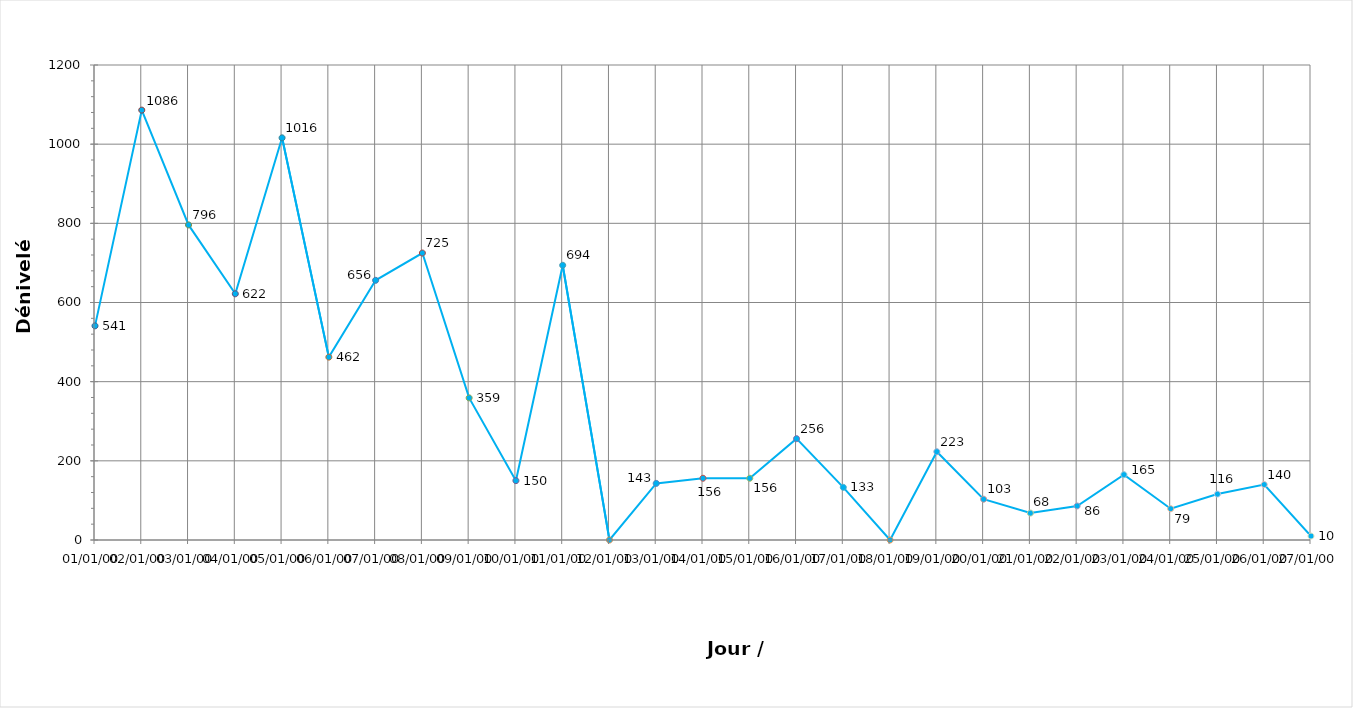
| Category | Series 0 |
|---|---|
| 0 | 541 |
| 1900-01-01 | 1086 |
| 1900-01-02 | 796 |
| 1900-01-03 | 622 |
| 1900-01-04 | 1016 |
| 1900-01-05 | 462 |
| 1900-01-06 | 656 |
| 1900-01-07 | 725 |
| 1900-01-08 | 359 |
| 1900-01-09 | 150 |
| 1900-01-10 | 694 |
| 1900-01-11 | 0 |
| 1900-01-12 | 143 |
| 1900-01-13 | 156 |
| 1900-01-14 | 156 |
| 1900-01-15 | 256 |
| 1900-01-16 | 133 |
| 1900-01-17 | 0 |
| 1900-01-18 | 223 |
| 1900-01-19 | 103 |
| 1900-01-20 | 68 |
| 1900-01-21 | 86 |
| 1900-01-22 | 165 |
| 1900-01-23 | 79 |
| 1900-01-24 | 116 |
| 1900-01-25 | 140 |
| 1900-01-26 | 10 |